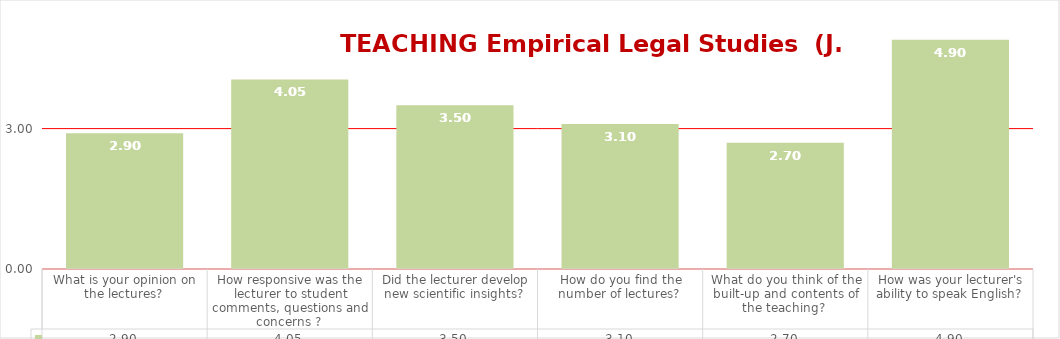
| Category | Series 0 |
|---|---|
| What is your opinion on the lectures?  | 2.9 |
| How responsive was the lecturer to student comments, questions and concerns ?  | 4.05 |
| Did the lecturer develop new scientific insights?  | 3.5 |
| How do you find the number of lectures?  | 3.1 |
| What do you think of the built-up and contents of the teaching?  | 2.7 |
| How was your lecturer's ability to speak English?  | 4.9 |